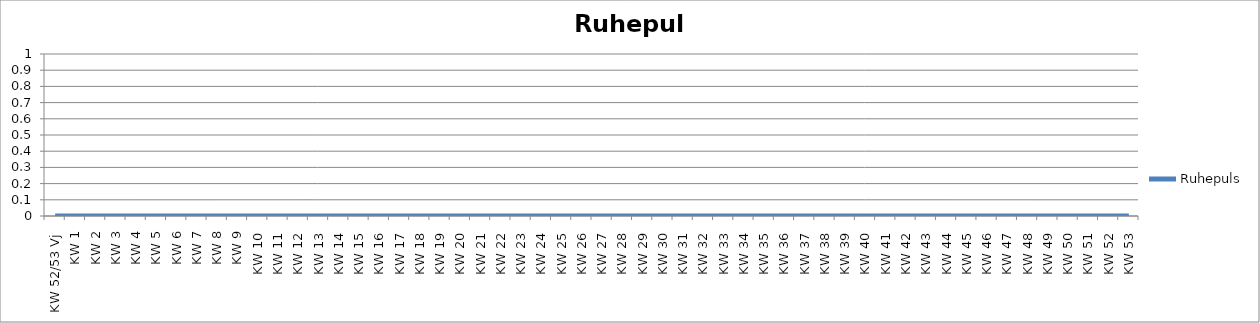
| Category | Ruhepuls |
|---|---|
| KW 52/53 Vj | 0 |
| KW 1 | 0 |
| KW 2 | 0 |
| KW 3 | 0 |
| KW 4 | 0 |
| KW 5 | 0 |
| KW 6 | 0 |
| KW 7 | 0 |
| KW 8 | 0 |
| KW 9 | 0 |
| KW 10 | 0 |
| KW 11 | 0 |
| KW 12 | 0 |
| KW 13 | 0 |
| KW 14 | 0 |
| KW 15 | 0 |
| KW 16 | 0 |
| KW 17 | 0 |
| KW 18 | 0 |
| KW 19 | 0 |
| KW 20 | 0 |
| KW 21 | 0 |
| KW 22 | 0 |
| KW 23 | 0 |
| KW 24 | 0 |
| KW 25 | 0 |
| KW 26 | 0 |
| KW 27 | 0 |
| KW 28 | 0 |
| KW 29 | 0 |
| KW 30 | 0 |
| KW 31 | 0 |
| KW 32 | 0 |
| KW 33 | 0 |
| KW 34 | 0 |
| KW 35 | 0 |
| KW 36 | 0 |
| KW 37 | 0 |
| KW 38 | 0 |
| KW 39 | 0 |
| KW 40 | 0 |
| KW 41 | 0 |
| KW 42 | 0 |
| KW 43 | 0 |
| KW 44 | 0 |
| KW 45 | 0 |
| KW 46 | 0 |
| KW 47 | 0 |
| KW 48 | 0 |
| KW 49 | 0 |
| KW 50 | 0 |
| KW 51 | 0 |
| KW 52 | 0 |
| KW 53 | 0 |